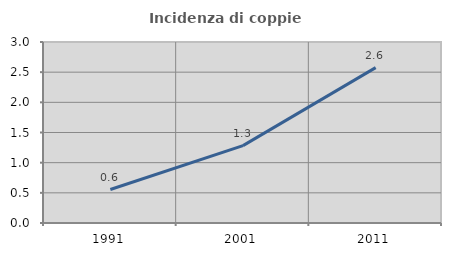
| Category | Incidenza di coppie miste |
|---|---|
| 1991.0 | 0.555 |
| 2001.0 | 1.282 |
| 2011.0 | 2.575 |